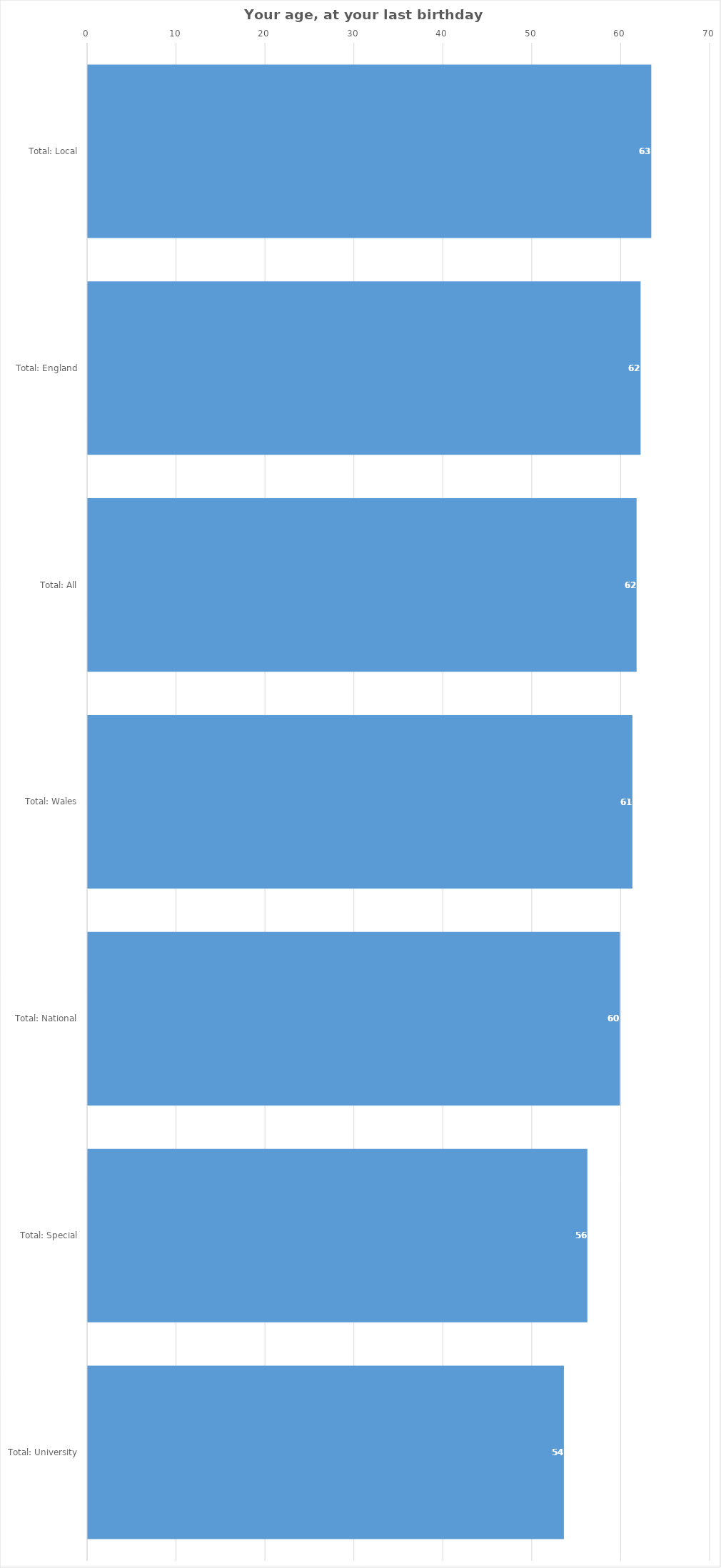
| Category | Your age, at your last birthday |
|---|---|
| Total: Local | 63.364 |
| Total: England | 62.163 |
| Total: All | 61.711 |
| Total: Wales | 61.243 |
| Total: National | 59.841 |
| Total: Special | 56.176 |
| Total: University | 53.539 |